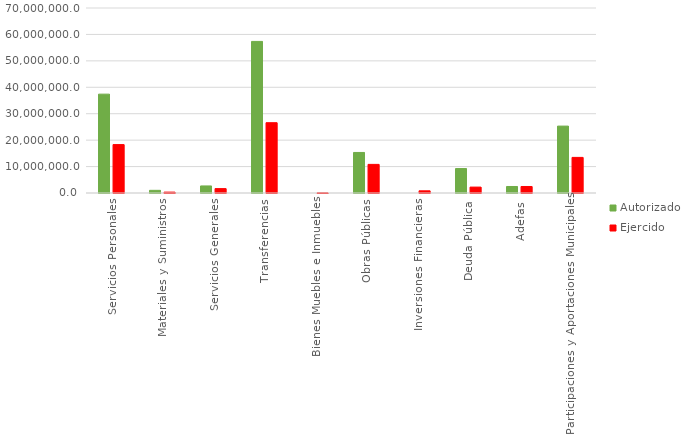
| Category | Autorizado | Ejercido |
|---|---|---|
| Servicios Personales | 37400976 | 18321107.3 |
| Materiales y Suministros | 1007654.6 | 325255.8 |
| Servicios Generales | 2671441.9 | 1658322.1 |
| Transferencias | 57359240.2 | 26596359.6 |
| Bienes Muebles e Inmuebles | 0 | 50879.3 |
| Obras Públicas | 15340179.3 | 10826655.3 |
| Inversiones Financieras | 0 | 824655.6 |
| Deuda Pública | 9250255.7 | 2231555 |
| Adefas | 2460661.3 | 2460410.7 |
| Participaciones y Aportaciones Municipales | 25313146.3 | 13469617.3 |